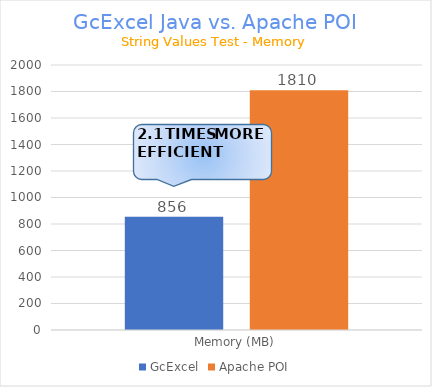
| Category | GcExcel | Apache POI |
|---|---|---|
| Memory (MB) | 855.576 | 1809.654 |